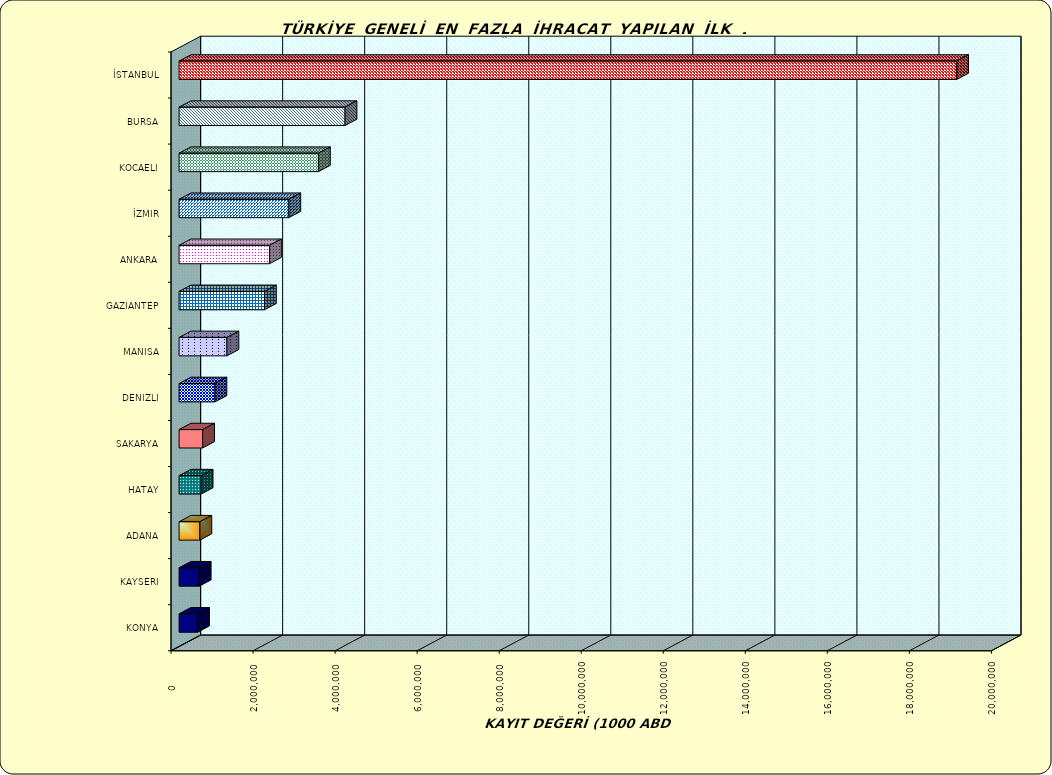
| Category | Series 0 |
|---|---|
| İSTANBUL | 18956763.347 |
| BURSA | 4046410.351 |
| KOCAELI | 3398321.151 |
| İZMIR | 2676666.938 |
| ANKARA | 2204792.834 |
| GAZIANTEP | 2082385.642 |
| MANISA | 1167416.801 |
| DENIZLI | 874749.722 |
| SAKARYA | 574343.465 |
| HATAY | 538604.753 |
| ADANA | 508125.435 |
| KAYSERI | 492001.725 |
| KONYA | 450933.952 |